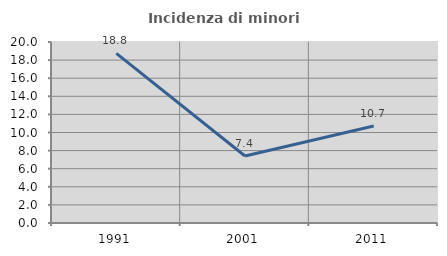
| Category | Incidenza di minori stranieri |
|---|---|
| 1991.0 | 18.75 |
| 2001.0 | 7.407 |
| 2011.0 | 10.714 |